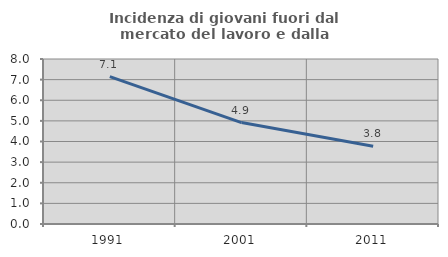
| Category | Incidenza di giovani fuori dal mercato del lavoro e dalla formazione  |
|---|---|
| 1991.0 | 7.143 |
| 2001.0 | 4.918 |
| 2011.0 | 3.774 |